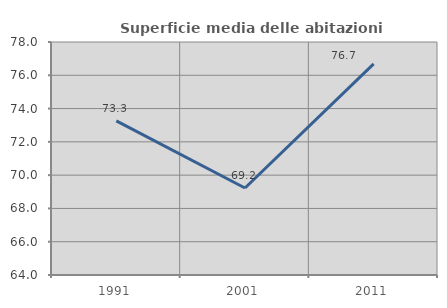
| Category | Superficie media delle abitazioni occupate |
|---|---|
| 1991.0 | 73.259 |
| 2001.0 | 69.229 |
| 2011.0 | 76.689 |